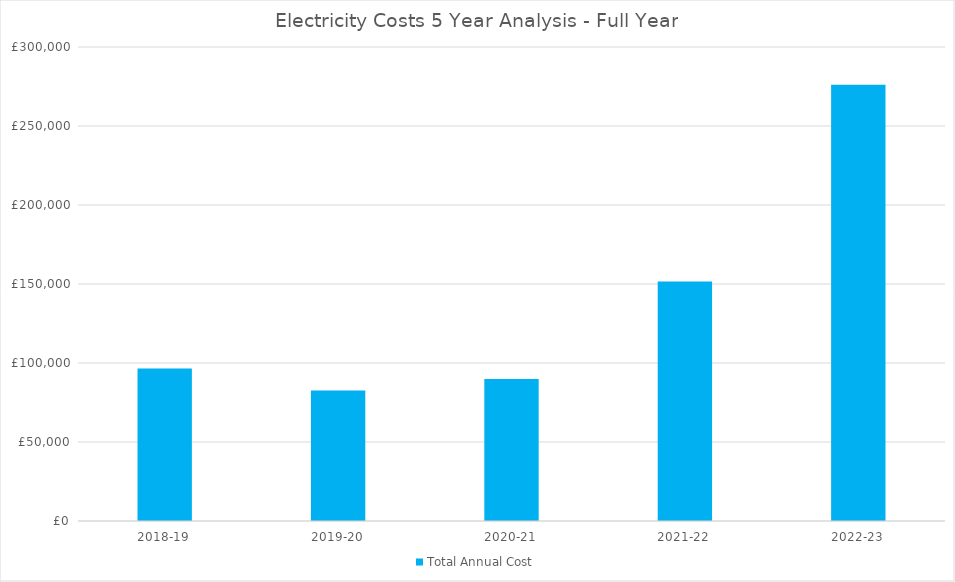
| Category | Total Annual Cost |
|---|---|
| 2018-19 | 96574.17 |
| 2019-20 | 82541.79 |
| 2020-21 | 89934 |
| 2021-22 | 151504 |
| 2022-23 | 276174 |